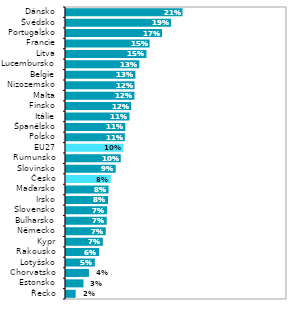
| Category | Series 1 |
|---|---|
| Řecko | 0.017 |
| Estonsko | 0.032 |
| Chorvatsko | 0.042 |
| Lotyšsko | 0.052 |
| Rakousko | 0.06 |
| Kypr | 0.067 |
| Německo | 0.072 |
| Bulharsko | 0.074 |
| Slovensko | 0.074 |
| Irsko | 0.076 |
| Maďarsko | 0.077 |
| Česko | 0.081 |
| Slovinsko | 0.09 |
| Rumunsko | 0.099 |
| EU27 | 0.104 |
| Polsko | 0.106 |
| Španělsko | 0.107 |
| Itálie | 0.115 |
| Finsko | 0.118 |
| Malta | 0.124 |
| Nizozemsko | 0.124 |
| Belgie | 0.126 |
| Lucembursko | 0.133 |
| Litva | 0.146 |
| Francie | 0.151 |
| Portugalsko | 0.174 |
| Švédsko | 0.19 |
| Dánsko | 0.211 |